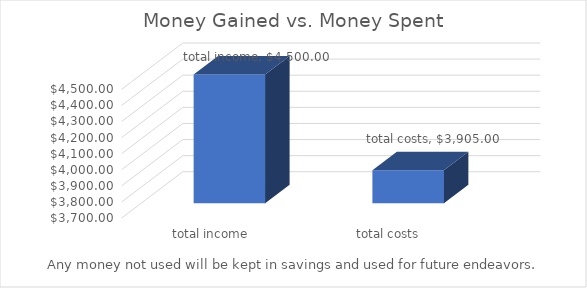
| Category | Series 0 |
|---|---|
| total income | 4500 |
| total costs | 3905 |